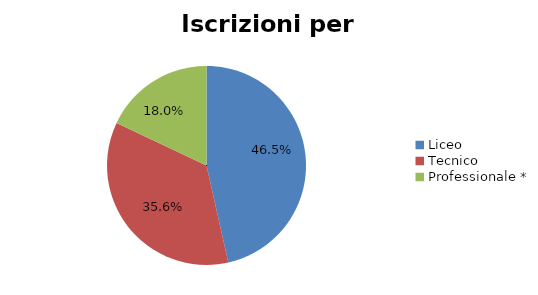
| Category | Series 0 |
|---|---|
| Liceo  | 18388 |
| Tecnico | 14066 |
| Professionale * | 7107 |